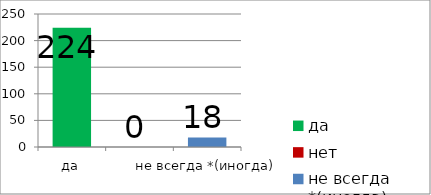
| Category | Series 0 |
|---|---|
| да | 224 |
| нет | 0 |
| не всегда *(иногда) | 18 |